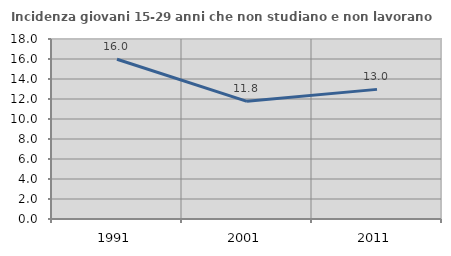
| Category | Incidenza giovani 15-29 anni che non studiano e non lavorano  |
|---|---|
| 1991.0 | 15.977 |
| 2001.0 | 11.765 |
| 2011.0 | 12.963 |